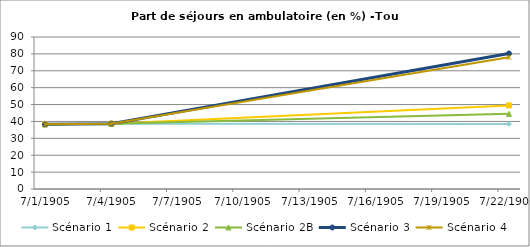
| Category | Scénario 1 | Scénario 2 | Scénario 2B | Scénario 3 | Scénario 4 |
|---|---|---|---|---|---|
| 2009.0 | 38.276 | 38.276 | 38.276 | 38.276 | 38.276 |
| 2012.0 | 38.708 | 38.708 | 38.708 | 38.708 | 38.708 |
| 2030.0 | 38.474 | 49.493 | 44.486 | 80.223 | 77.971 |